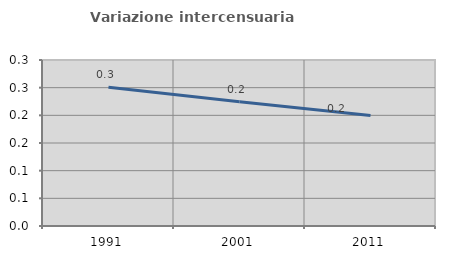
| Category | Variazione intercensuaria annua |
|---|---|
| 1991.0 | 0.251 |
| 2001.0 | 0.225 |
| 2011.0 | 0.2 |